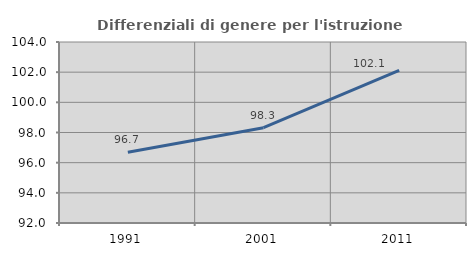
| Category | Differenziali di genere per l'istruzione superiore |
|---|---|
| 1991.0 | 96.691 |
| 2001.0 | 98.318 |
| 2011.0 | 102.118 |